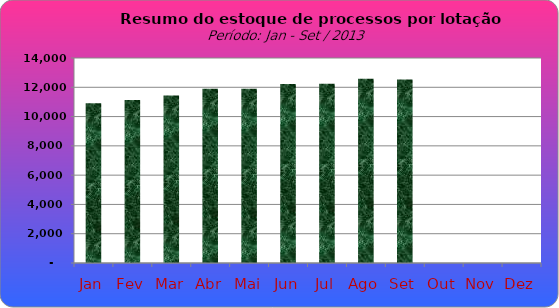
| Category | Series 0 |
|---|---|
| Jan | 10909 |
| Fev | 11131 |
| Mar | 11446 |
| Abr | 11893 |
| Mai | 11901 |
| Jun | 12228 |
| Jul | 12248 |
| Ago | 12576 |
| Set | 12532 |
| Out | 0 |
| Nov | 0 |
| Dez | 0 |